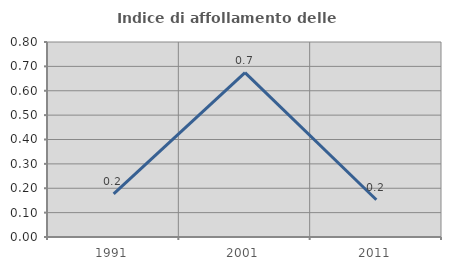
| Category | Indice di affollamento delle abitazioni  |
|---|---|
| 1991.0 | 0.177 |
| 2001.0 | 0.675 |
| 2011.0 | 0.153 |